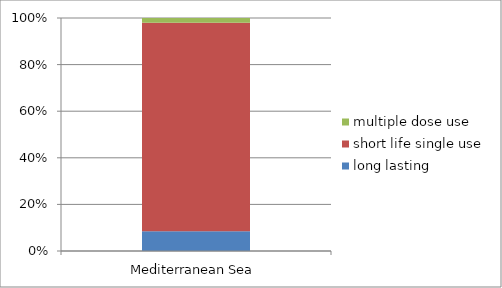
| Category | long lasting | short life single use | multiple dose use |
|---|---|---|---|
| Mediterranean Sea | 2196 | 23252 | 539 |